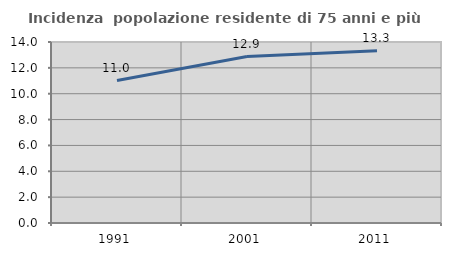
| Category | Incidenza  popolazione residente di 75 anni e più |
|---|---|
| 1991.0 | 11.017 |
| 2001.0 | 12.875 |
| 2011.0 | 13.318 |